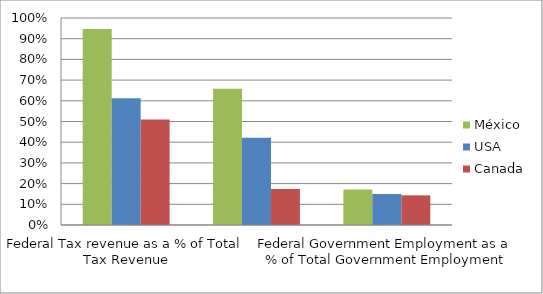
| Category | México | USA | Canada |
|---|---|---|---|
| Federal Tax revenue as a % of Total Tax Revenue | 0.946 | 0.612 | 0.51 |
| Federal Government Consumption as a % of Total Government Consumption | 0.658 | 0.422 | 0.174 |
| Federal Government Employment as a % of Total Government Employment | 0.171 | 0.15 | 0.143 |